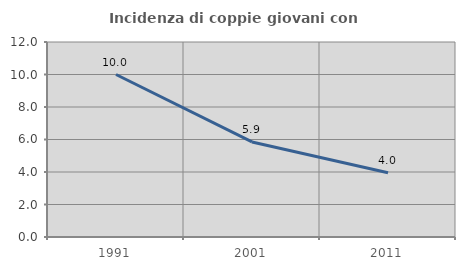
| Category | Incidenza di coppie giovani con figli |
|---|---|
| 1991.0 | 10 |
| 2001.0 | 5.851 |
| 2011.0 | 3.955 |